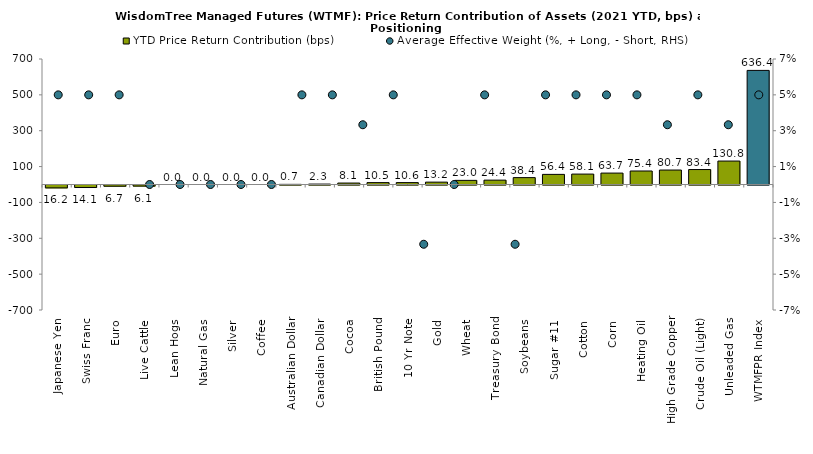
| Category | YTD Price Return Contribution (bps) |
|---|---|
| Japanese Yen | -16.172 |
| Swiss Franc | -14.115 |
| Euro | -6.737 |
| Live Cattle | -6.091 |
| Lean Hogs | 0 |
| Natural Gas | 0 |
| Silver | 0 |
| Coffee | 0 |
| Australian Dollar | 0.714 |
| Canadian Dollar | 2.276 |
| Cocoa | 8.066 |
| British Pound | 10.478 |
| 10 Yr Note | 10.609 |
| Gold | 13.218 |
| Wheat | 23.017 |
| Treasury Bond | 24.384 |
| Soybeans | 38.386 |
| Sugar #11 | 56.449 |
| Cotton | 58.054 |
| Corn | 63.676 |
| Heating Oil | 75.375 |
| High Grade Copper | 80.652 |
| Crude Oil (Light) | 83.43 |
| Unleaded Gas | 130.755 |
| WTMFPR Index | 636.425 |